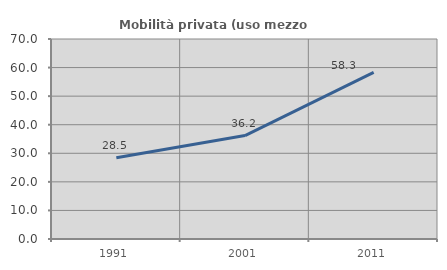
| Category | Mobilità privata (uso mezzo privato) |
|---|---|
| 1991.0 | 28.472 |
| 2001.0 | 36.19 |
| 2011.0 | 58.333 |